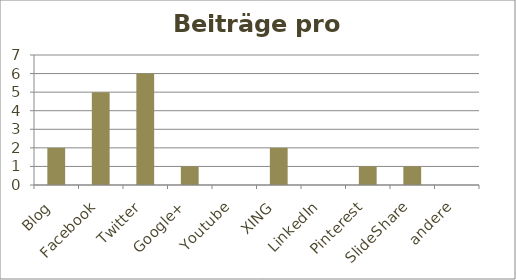
| Category | Beiträge |
|---|---|
| Blog | 2 |
| Facebook | 5 |
| Twitter | 6 |
| Google+ | 1 |
| Youtube | 0 |
| XING | 2 |
| LinkedIn | 0 |
| Pinterest | 1 |
| SlideShare | 1 |
| andere | 0 |